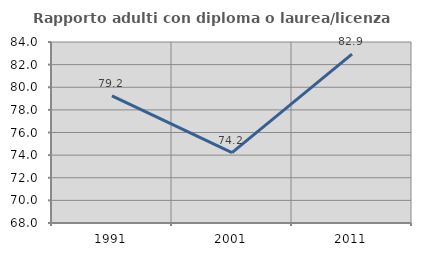
| Category | Rapporto adulti con diploma o laurea/licenza media  |
|---|---|
| 1991.0 | 79.234 |
| 2001.0 | 74.217 |
| 2011.0 | 82.924 |